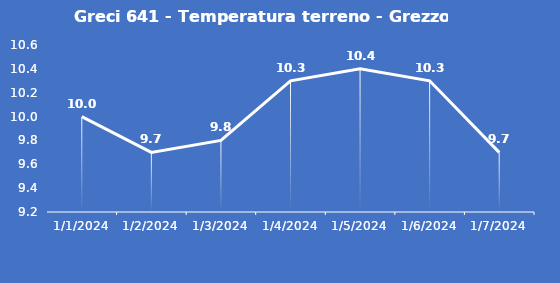
| Category | Greci 641 - Temperatura terreno - Grezzo (°C) |
|---|---|
| 1/1/24 | 10 |
| 1/2/24 | 9.7 |
| 1/3/24 | 9.8 |
| 1/4/24 | 10.3 |
| 1/5/24 | 10.4 |
| 1/6/24 | 10.3 |
| 1/7/24 | 9.7 |